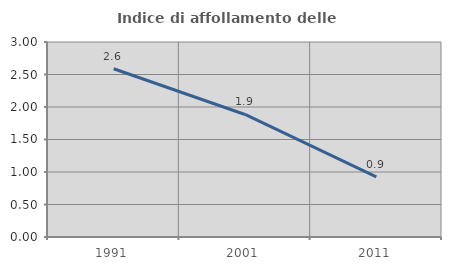
| Category | Indice di affollamento delle abitazioni  |
|---|---|
| 1991.0 | 2.588 |
| 2001.0 | 1.885 |
| 2011.0 | 0.925 |